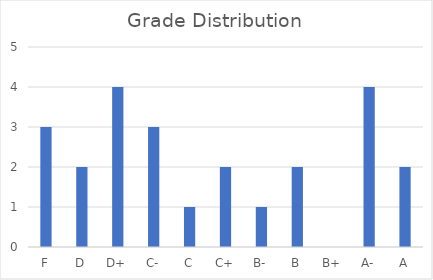
| Category | Series 0 |
|---|---|
| F | 3 |
| D | 2 |
| D+ | 4 |
| C- | 3 |
| C | 1 |
| C+ | 2 |
| B- | 1 |
| B | 2 |
| B+ | 0 |
| A- | 4 |
| A | 2 |